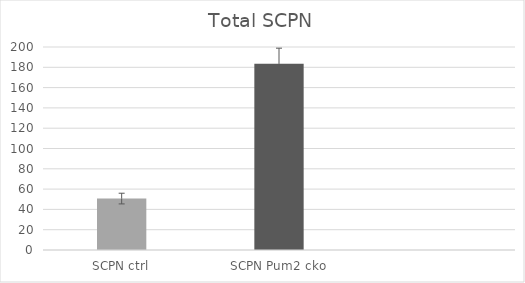
| Category | Total SCPN |
|---|---|
| SCPN ctrl | 50.667 |
| SCPN Pum2 cko | 183.5 |